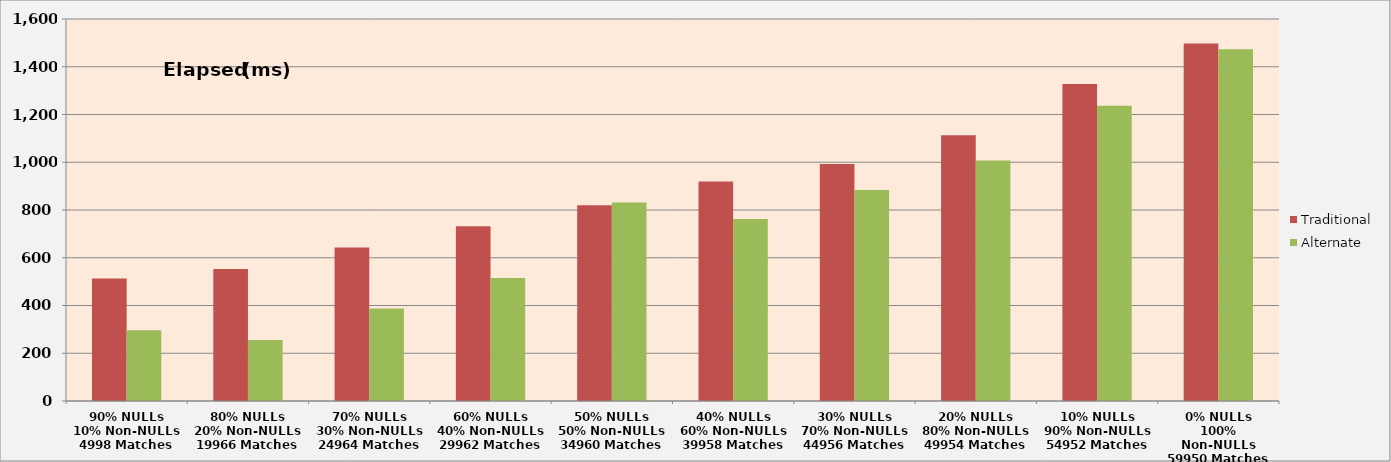
| Category | Traditional | Alternate |
|---|---|---|
| 90% NULLs
10% Non-NULLs
4998 Matches | 513 | 296 |
| 80% NULLs
20% Non-NULLs
19966 Matches | 553 | 256 |
| 70% NULLs
30% Non-NULLs
24964 Matches | 643 | 387 |
| 60% NULLs
40% Non-NULLs
29962 Matches | 732 | 515 |
| 50% NULLs
50% Non-NULLs
34960 Matches | 820 | 831 |
| 40% NULLs
60% Non-NULLs
39958 Matches | 919 | 762 |
| 30% NULLs
70% Non-NULLs
44956 Matches | 993 | 884 |
| 20% NULLs
80% Non-NULLs
49954 Matches | 1113 | 1007 |
| 10% NULLs
90% Non-NULLs
54952 Matches | 1328 | 1237 |
| 0% NULLs
100% Non-NULLs
59950 Matches | 1497 | 1473 |